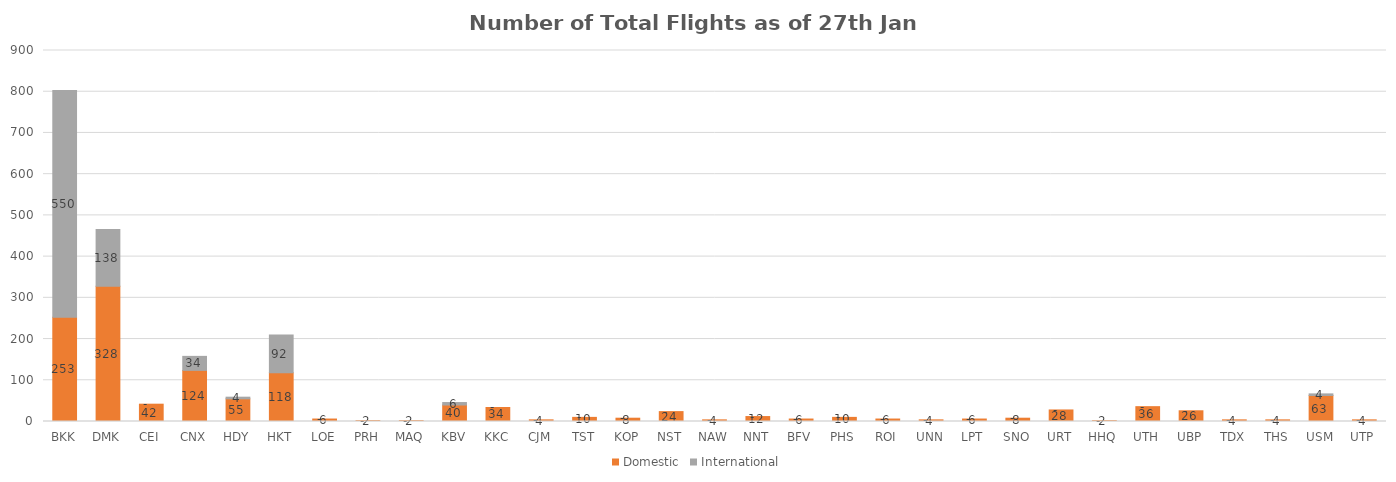
| Category | Domestic | International |
|---|---|---|
| BKK | 253 | 550 |
| DMK | 328 | 138 |
| CEI | 42 | 0 |
| CNX | 124 | 34 |
| HDY | 55 | 4 |
| HKT | 118 | 92 |
| LOE | 6 | 0 |
| PRH | 2 | 0 |
| MAQ | 2 | 0 |
| KBV | 40 | 6 |
| KKC | 34 | 0 |
| CJM | 4 | 0 |
| TST | 10 | 0 |
| KOP | 8 | 0 |
| NST | 24 | 0 |
| NAW | 4 | 0 |
| NNT | 12 | 0 |
| BFV | 6 | 0 |
| PHS | 10 | 0 |
| ROI | 6 | 0 |
| UNN | 4 | 0 |
| LPT | 6 | 0 |
| SNO | 8 | 0 |
| URT | 28 | 0 |
| HHQ | 2 | 0 |
| UTH | 36 | 0 |
| UBP | 26 | 0 |
| TDX | 4 | 0 |
| THS | 4 | 0 |
| USM | 63 | 4 |
| UTP | 4 | 0 |